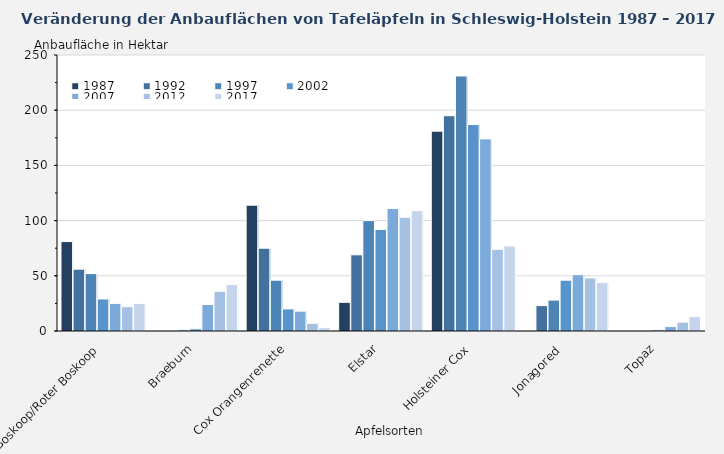
| Category | 1987 | 1992 | 1997 | 2002 | 2007 | 2012 | 2017 |
|---|---|---|---|---|---|---|---|
| Boskoop/Roter Boskoop | 81 | 56 | 52 | 29 | 25 | 22 | 25 |
| Braeburn | 0 | 0 | 1 | 2 | 24 | 36 | 42 |
| Cox Orangenrenette | 114 | 75 | 46 | 20 | 18 | 7 | 3 |
| Elstar | 26 | 69 | 100 | 92 | 111 | 103 | 109 |
| Holsteiner Cox | 181 | 195 | 231 | 187 | 174 | 74 | 77 |
| Jonagored  | 0 | 23 | 28 | 46 | 51 | 48 | 44 |
| Topaz | 0 | 0 | 0 | 1 | 4 | 8 | 13 |